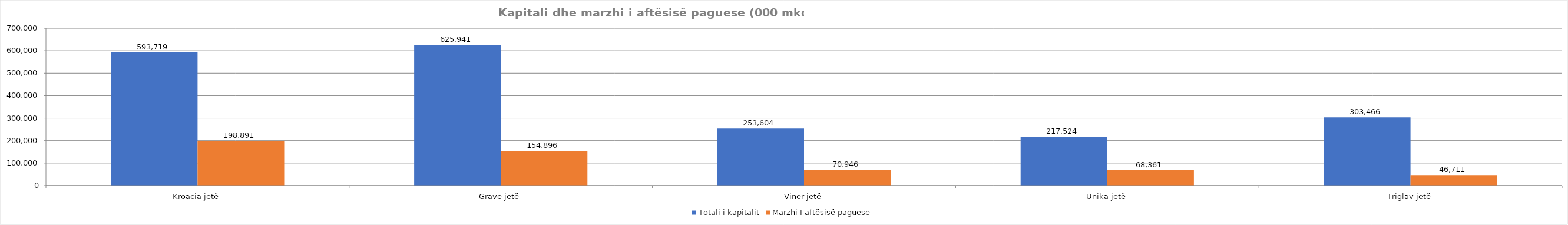
| Category | Totali i kapitalit | Marzhi I aftësisë paguese |
|---|---|---|
| Kroacia jetë | 593719 | 198891 |
| Grave jetë | 625941 | 154896 |
| Viner jetë | 253604 | 70946 |
| Unika jetë | 217524 | 68361 |
| Triglav jetë | 303466 | 46711 |